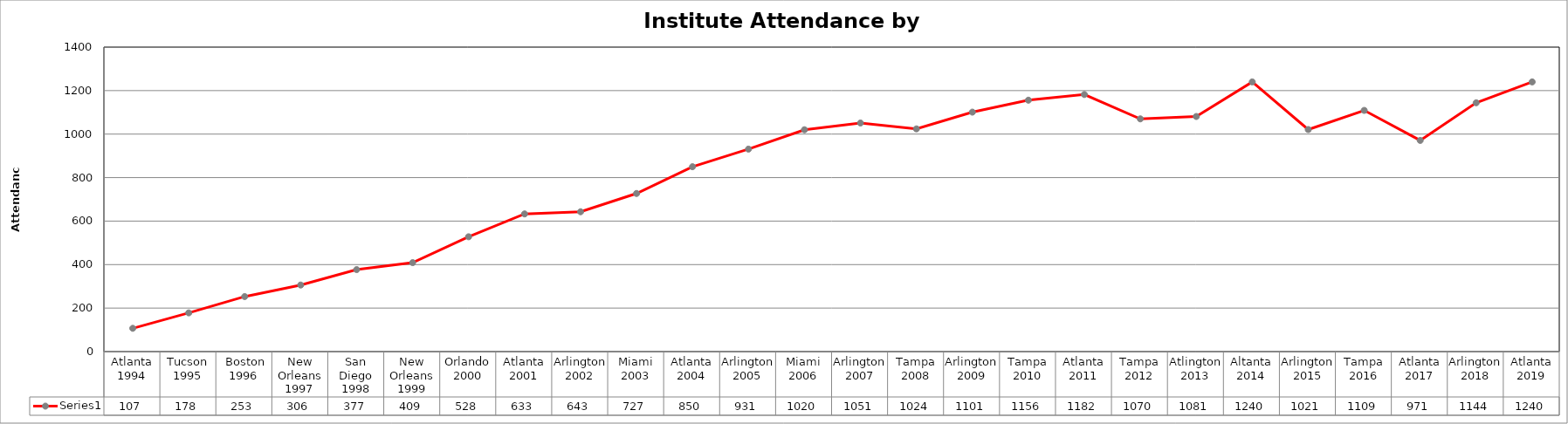
| Category | Series 2 |
|---|---|
| Atlanta 1994 | 107 |
| Tucson 1995 | 178 |
|  Boston 1996 | 253 |
| New Orleans 1997 | 306 |
| San Diego 1998 | 377 |
| New Orleans 1999 | 409 |
| Orlando 2000 | 528 |
| Atlanta 2001 | 633 |
| Arlington 2002 | 643 |
| Miami 2003 | 727 |
| Atlanta 2004 | 850 |
| Arlington 2005 | 931 |
| Miami 2006 | 1020 |
| Arlington 2007 | 1051 |
| Tampa 2008 | 1024 |
| Arlington 2009 | 1101 |
| Tampa 2010 | 1156 |
| Atlanta 2011 | 1182 |
| Tampa 2012 | 1070 |
| Atlington 2013 | 1081 |
| Altanta 2014 | 1240 |
| Arlington 2015 | 1021 |
| Tampa 2016 | 1109 |
| Atlanta 2017 | 971 |
| Arlington 2018 | 1144 |
| Atlanta 2019 | 1240 |